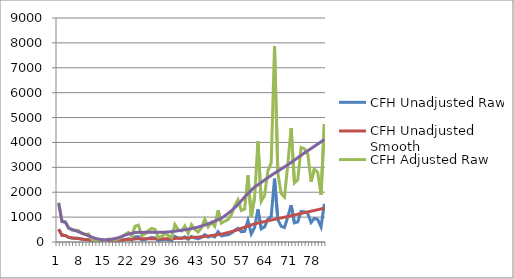
| Category | CFH Unadjusted Raw | CFH Unadjusted Smooth | CFH Adjusted Raw | CFH Adjusted Smooth |
|---|---|---|---|---|
| 0 | 512.336 | 512.336 | 1583.517 | 1553.752 |
| 1 | 270.364 | 270.363 | 835.634 | 819.927 |
| 2 | 262.969 | 262.969 | 812.779 | 797.501 |
| 3 | 184.58 | 183.196 | 570.498 | 555.577 |
| 4 | 152.971 | 166.685 | 472.8 | 505.503 |
| 5 | 152.271 | 151.513 | 470.637 | 459.49 |
| 6 | 148.019 | 135.232 | 457.494 | 410.116 |
| 7 | 109.981 | 117.687 | 339.927 | 356.907 |
| 8 | 97.543 | 100.382 | 301.485 | 304.428 |
| 9 | 105.013 | 83.001 | 324.573 | 251.717 |
| 10 | 33.922 | 64.247 | 104.845 | 194.841 |
| 11 | 24.206 | 49.18 | 74.816 | 149.147 |
| 12 | 20.022 | 38.365 | 61.883 | 116.35 |
| 13 | 27.7 | 31.747 | 85.614 | 96.277 |
| 14 | 15.133 | 28.718 | 46.774 | 87.092 |
| 15 | 38.977 | 31.347 | 120.468 | 95.067 |
| 16 | 32.554 | 36.877 | 100.619 | 111.837 |
| 17 | 30.752 | 46.094 | 95.049 | 139.788 |
| 18 | 39.787 | 56.915 | 122.972 | 172.606 |
| 19 | 68.115 | 72.608 | 210.528 | 220.198 |
| 20 | 98.669 | 90.379 | 304.964 | 274.09 |
| 21 | 124.61 | 104.841 | 385.142 | 317.949 |
| 22 | 79.19 | 114.914 | 244.759 | 348.499 |
| 23 | 204.474 | 124.652 | 631.983 | 378.031 |
| 24 | 218.612 | 127.92 | 675.682 | 387.94 |
| 25 | 84.743 | 127.345 | 261.924 | 386.198 |
| 26 | 103.424 | 127.672 | 319.661 | 387.19 |
| 27 | 146.946 | 128.488 | 454.179 | 389.663 |
| 28 | 177.324 | 127.978 | 548.071 | 388.117 |
| 29 | 164.091 | 128.133 | 507.169 | 388.586 |
| 30 | 58.528 | 127.936 | 180.898 | 387.99 |
| 31 | 72.564 | 128.567 | 224.28 | 389.902 |
| 32 | 108.854 | 130.413 | 336.443 | 395.502 |
| 33 | 84.641 | 132.784 | 261.606 | 402.693 |
| 34 | 55.249 | 137.551 | 170.764 | 417.149 |
| 35 | 226.752 | 143.279 | 700.84 | 434.521 |
| 36 | 159.62 | 149.042 | 493.349 | 451.997 |
| 37 | 143.333 | 155.049 | 443.01 | 470.215 |
| 38 | 207.642 | 162.465 | 641.776 | 492.705 |
| 39 | 110.775 | 168.546 | 342.382 | 511.148 |
| 40 | 225.204 | 177.749 | 696.057 | 539.056 |
| 41 | 161.443 | 187.314 | 498.986 | 568.064 |
| 42 | 129.451 | 197.969 | 400.104 | 600.377 |
| 43 | 183.773 | 209.738 | 568.002 | 636.069 |
| 44 | 296.948 | 226.456 | 917.801 | 686.768 |
| 45 | 197.116 | 240.492 | 609.243 | 729.336 |
| 46 | 254.224 | 256.798 | 785.752 | 778.788 |
| 47 | 202.783 | 276.389 | 626.758 | 838.199 |
| 48 | 412.802 | 295.913 | 1275.881 | 897.411 |
| 49 | 244.933 | 313.911 | 757.034 | 951.993 |
| 50 | 270.96 | 345.487 | 837.478 | 1047.752 |
| 51 | 290.843 | 379.278 | 898.932 | 1150.231 |
| 52 | 353.304 | 413.823 | 1091.984 | 1254.996 |
| 53 | 469.684 | 453.617 | 1451.689 | 1375.677 |
| 54 | 549.112 | 497.751 | 1697.187 | 1509.523 |
| 55 | 409.54 | 546.046 | 1265.798 | 1655.986 |
| 56 | 427.378 | 595.839 | 1320.933 | 1806.992 |
| 57 | 864.659 | 642.047 | 2672.473 | 1947.125 |
| 58 | 323.583 | 686.228 | 1000.123 | 2081.113 |
| 59 | 579.952 | 727.685 | 1792.506 | 2206.839 |
| 60 | 1308.15 | 758.464 | 4043.205 | 2300.181 |
| 61 | 529.682 | 788.605 | 1637.132 | 2391.59 |
| 62 | 605.361 | 820.248 | 1871.037 | 2487.554 |
| 63 | 922.907 | 852.171 | 2852.503 | 2584.368 |
| 64 | 1027.759 | 882.711 | 3176.578 | 2676.983 |
| 65 | 2544.028 | 910.931 | 7863.034 | 2762.568 |
| 66 | 896.388 | 939.001 | 2770.541 | 2847.694 |
| 67 | 630.79 | 967.077 | 1949.633 | 2932.84 |
| 68 | 583.366 | 994.92 | 1803.056 | 3017.281 |
| 69 | 1013.584 | 1022.986 | 3132.766 | 3102.394 |
| 70 | 1480.434 | 1053.604 | 4575.697 | 3195.251 |
| 71 | 768.136 | 1085.006 | 2374.141 | 3290.483 |
| 72 | 808.838 | 1116.696 | 2499.943 | 3386.587 |
| 73 | 1228.029 | 1148.163 | 3795.569 | 3482.017 |
| 74 | 1212.542 | 1180.005 | 3747.702 | 3578.584 |
| 75 | 1147.862 | 1208.959 | 3547.79 | 3666.392 |
| 76 | 786.014 | 1238.165 | 2429.398 | 3754.966 |
| 77 | 948.329 | 1267.595 | 2931.076 | 3844.218 |
| 78 | 905.028 | 1297.312 | 2797.243 | 3934.338 |
| 79 | 611.62 | 1327.111 | 1890.383 | 4024.709 |
| 80 | 1534.143 | 1356.91 | 4741.7 | 4115.08 |